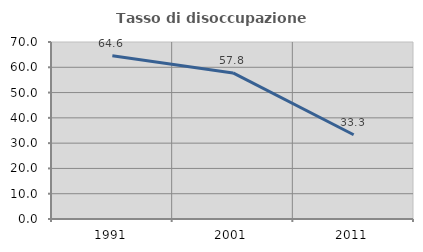
| Category | Tasso di disoccupazione giovanile  |
|---|---|
| 1991.0 | 64.557 |
| 2001.0 | 57.778 |
| 2011.0 | 33.333 |